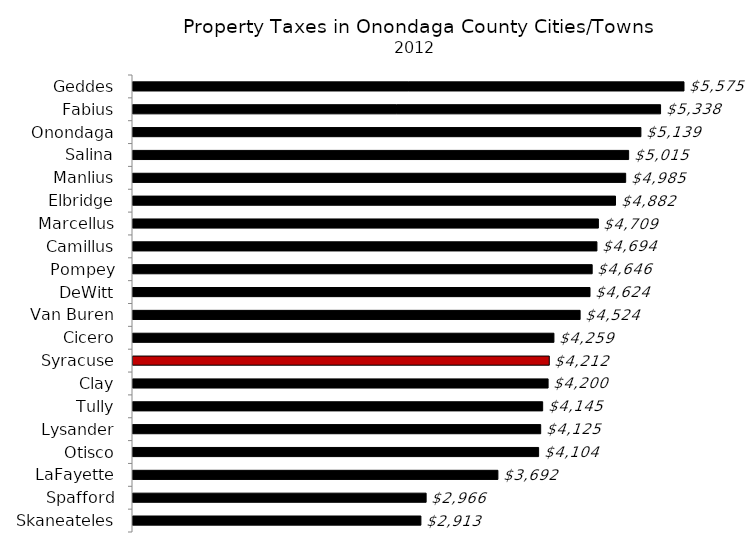
| Category | Series 0 |
|---|---|
| Skaneateles | 2913 |
| Spafford | 2966 |
| LaFayette | 3692 |
| Otisco | 4104 |
| Lysander | 4125 |
| Tully | 4145 |
| Clay | 4200 |
| Syracuse | 4212 |
| Cicero | 4259 |
| Van Buren | 4524 |
| DeWitt | 4624 |
| Pompey | 4646 |
| Camillus | 4694 |
| Marcellus | 4709 |
| Elbridge | 4882 |
| Manlius | 4985 |
| Salina | 5015 |
| Onondaga | 5139 |
| Fabius | 5338 |
| Geddes | 5575 |